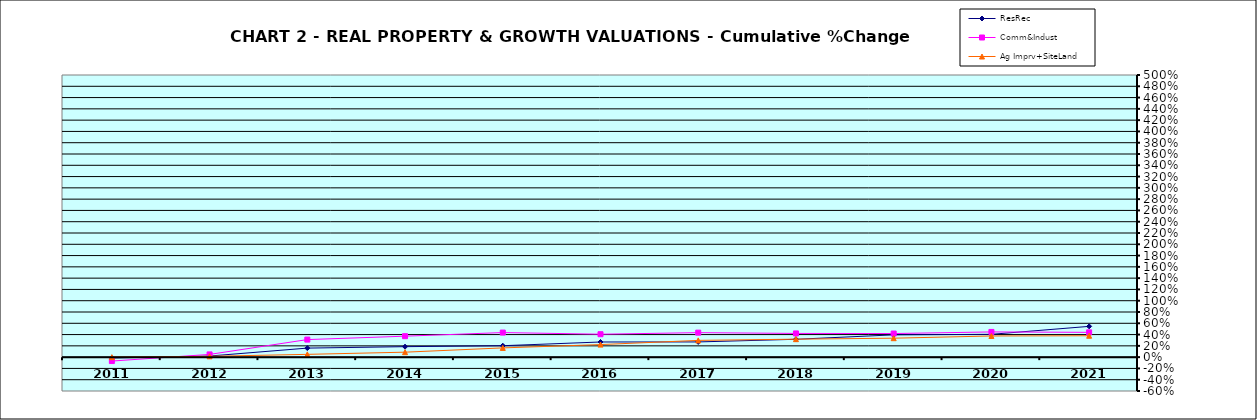
| Category | ResRec | Comm&Indust | Ag Imprv+SiteLand |
|---|---|---|---|
| 2011.0 | -0.016 | -0.069 | 0 |
| 2012.0 | 0.019 | 0.048 | 0.015 |
| 2013.0 | 0.16 | 0.311 | 0.049 |
| 2014.0 | 0.186 | 0.372 | 0.088 |
| 2015.0 | 0.203 | 0.435 | 0.164 |
| 2016.0 | 0.268 | 0.406 | 0.222 |
| 2017.0 | 0.27 | 0.434 | 0.297 |
| 2018.0 | 0.316 | 0.42 | 0.319 |
| 2019.0 | 0.395 | 0.418 | 0.336 |
| 2020.0 | 0.404 | 0.447 | 0.375 |
| 2021.0 | 0.545 | 0.439 | 0.379 |